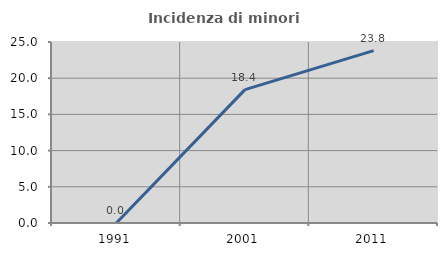
| Category | Incidenza di minori stranieri |
|---|---|
| 1991.0 | 0 |
| 2001.0 | 18.421 |
| 2011.0 | 23.81 |